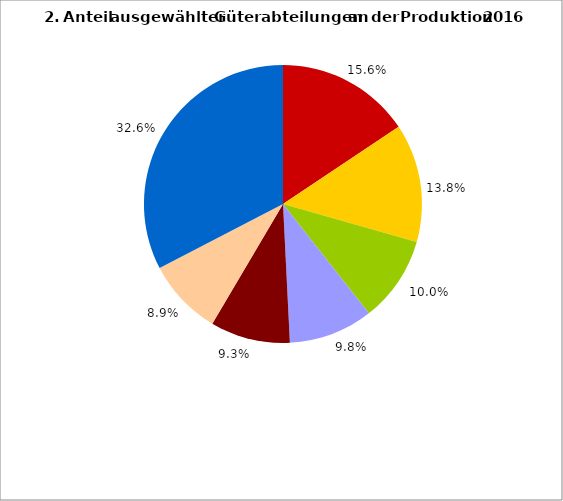
| Category | Series 0 |
|---|---|
| 0 | 15.634 |
| 1 | 13.763 |
| 2 | 9.998 |
| 3 | 9.817 |
| 4 | 9.283 |
| 5 | 8.887 |
| 6 | 32.619 |